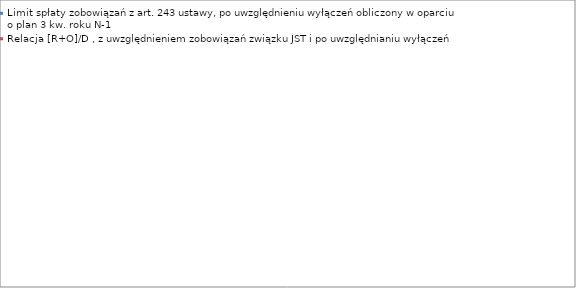
| Category | Limit spłaty zobowiązań z art. 243 ustawy, po uwzględnieniu wyłączeń obliczony w oparciu o plan 3 kw. roku N-1 | Relacja [R+O]/D , z uwzględnieniem zobowiązań związku JST i po uwzględnianiu wyłączeń |
|---|---|---|
| 2014.0 | 0.189 | 0.058 |
| 2015.0 | 0.219 | 0 |
| 2016.0 | 0.183 | 0 |
| 2017.0 | 0.188 | 0 |